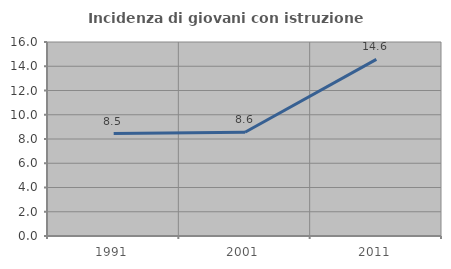
| Category | Incidenza di giovani con istruzione universitaria |
|---|---|
| 1991.0 | 8.451 |
| 2001.0 | 8.553 |
| 2011.0 | 14.563 |